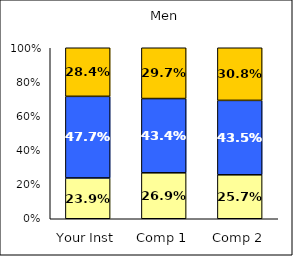
| Category | Low Academic Disengagement | Average Academic Disengagement | High Academic Disengagement |
|---|---|---|---|
| Your Inst | 0.239 | 0.477 | 0.284 |
| Comp 1 | 0.269 | 0.434 | 0.297 |
| Comp 2 | 0.257 | 0.435 | 0.308 |